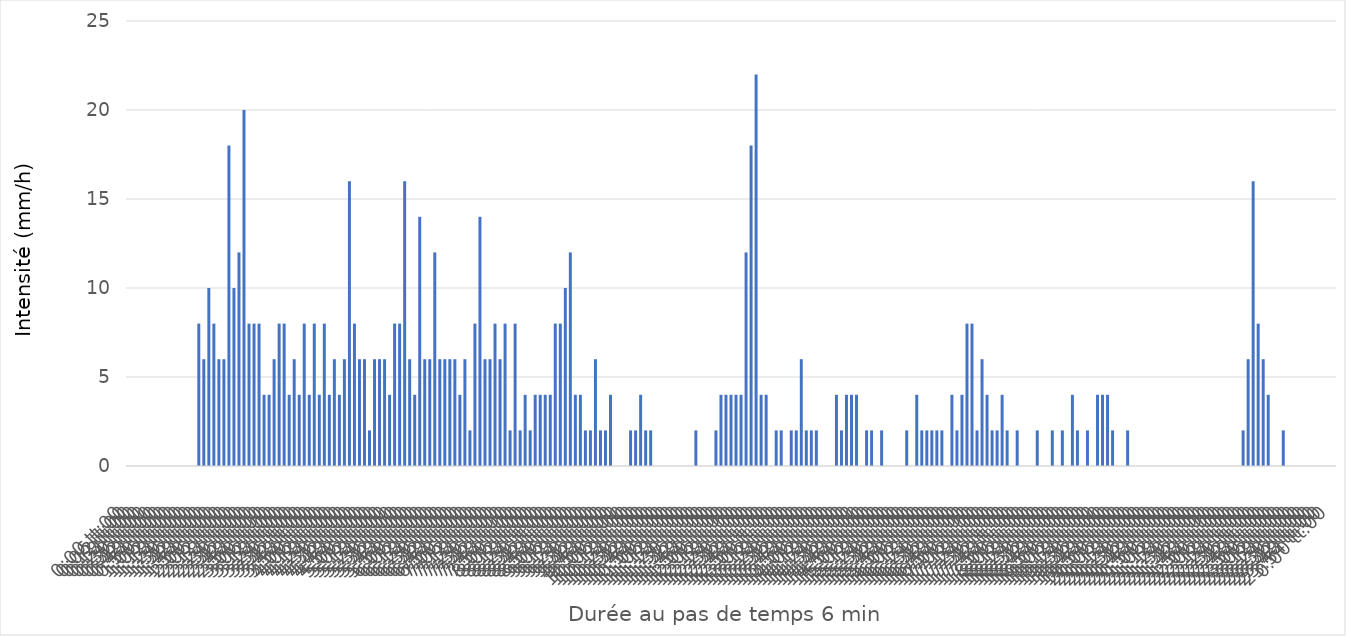
| Category | Series 0 |
|---|---|
| 0.0 | 0 |
| 0.004166666666666667 | 0 |
| 0.00833333333333333 | 0 |
| 0.0125 | 0 |
| 0.0166666666666667 | 0 |
| 0.0208333333333333 | 0 |
| 0.025 | 0 |
| 0.0291666666666667 | 0 |
| 0.0333333333333333 | 0 |
| 0.0375 | 0 |
| 0.0416666666666667 | 0 |
| 0.0458333333333333 | 0 |
| 0.05 | 0 |
| 0.0541666666666667 | 0 |
| 0.0583333333333333 | 8 |
| 0.0625 | 6 |
| 0.0666666666666667 | 10 |
| 0.0708333333333333 | 8 |
| 0.075 | 6 |
| 0.0791666666666667 | 6 |
| 0.0833333333333333 | 18 |
| 0.0875 | 10 |
| 0.0916666666666667 | 12 |
| 0.0958333333333333 | 20 |
| 0.1 | 8 |
| 0.104166666666667 | 8 |
| 0.108333333333333 | 8 |
| 0.1125 | 4 |
| 0.116666666666667 | 4 |
| 0.120833333333333 | 6 |
| 0.125 | 8 |
| 0.129166666666667 | 8 |
| 0.133333333333333 | 4 |
| 0.1375 | 6 |
| 0.141666666666667 | 4 |
| 0.145833333333333 | 8 |
| 0.15 | 4 |
| 0.154166666666667 | 8 |
| 0.158333333333333 | 4 |
| 0.1625 | 8 |
| 0.166666666666667 | 4 |
| 0.170833333333333 | 6 |
| 0.175 | 4 |
| 0.179166666666667 | 6 |
| 0.183333333333333 | 16 |
| 0.1875 | 8 |
| 0.191666666666667 | 6 |
| 0.195833333333333 | 6 |
| 0.2 | 2 |
| 0.204166666666667 | 6 |
| 0.208333333333333 | 6 |
| 0.2125 | 6 |
| 0.216666666666667 | 4 |
| 0.220833333333333 | 8 |
| 0.225 | 8 |
| 0.229166666666667 | 16 |
| 0.233333333333333 | 6 |
| 0.2375 | 4 |
| 0.241666666666667 | 14 |
| 0.245833333333333 | 6 |
| 0.25 | 6 |
| 0.254166666666667 | 12 |
| 0.258333333333333 | 6 |
| 0.2625 | 6 |
| 0.266666666666667 | 6 |
| 0.270833333333333 | 6 |
| 0.275 | 4 |
| 0.279166666666667 | 6 |
| 0.283333333333333 | 2 |
| 0.2875 | 8 |
| 0.291666666666667 | 14 |
| 0.295833333333333 | 6 |
| 0.3 | 6 |
| 0.304166666666667 | 8 |
| 0.308333333333333 | 6 |
| 0.3125 | 8 |
| 0.316666666666667 | 2 |
| 0.320833333333333 | 8 |
| 0.325 | 2 |
| 0.329166666666667 | 4 |
| 0.333333333333333 | 2 |
| 0.3375 | 4 |
| 0.341666666666667 | 4 |
| 0.345833333333333 | 4 |
| 0.35 | 4 |
| 0.354166666666667 | 8 |
| 0.358333333333333 | 8 |
| 0.3625 | 10 |
| 0.366666666666667 | 12 |
| 0.370833333333333 | 4 |
| 0.375 | 4 |
| 0.379166666666667 | 2 |
| 0.383333333333333 | 2 |
| 0.3875 | 6 |
| 0.391666666666667 | 2 |
| 0.395833333333333 | 2 |
| 0.4 | 4 |
| 0.404166666666667 | 0 |
| 0.408333333333333 | 0 |
| 0.4125 | 0 |
| 0.416666666666667 | 2 |
| 0.420833333333333 | 2 |
| 0.425 | 4 |
| 0.429166666666667 | 2 |
| 0.433333333333333 | 2 |
| 0.4375 | 0 |
| 0.441666666666667 | 0 |
| 0.445833333333333 | 0 |
| 0.45 | 0 |
| 0.454166666666667 | 0 |
| 0.458333333333333 | 0 |
| 0.4625 | 0 |
| 0.466666666666667 | 0 |
| 0.470833333333333 | 2 |
| 0.475 | 0 |
| 0.479166666666667 | 0 |
| 0.483333333333333 | 0 |
| 0.4875 | 2 |
| 0.491666666666667 | 4 |
| 0.495833333333333 | 4 |
| 0.5 | 4 |
| 0.504166666666667 | 4 |
| 0.508333333333333 | 4 |
| 0.5125 | 12 |
| 0.516666666666667 | 18 |
| 0.520833333333333 | 22 |
| 0.525 | 4 |
| 0.529166666666667 | 4 |
| 0.533333333333333 | 0 |
| 0.5375 | 2 |
| 0.541666666666667 | 2 |
| 0.545833333333333 | 0 |
| 0.55 | 2 |
| 0.554166666666667 | 2 |
| 0.558333333333333 | 6 |
| 0.5625 | 2 |
| 0.566666666666667 | 2 |
| 0.570833333333333 | 2 |
| 0.575 | 0 |
| 0.579166666666667 | 0 |
| 0.583333333333333 | 0 |
| 0.5875 | 4 |
| 0.591666666666667 | 2 |
| 0.595833333333333 | 4 |
| 0.6 | 4 |
| 0.604166666666667 | 4 |
| 0.608333333333333 | 0 |
| 0.6125 | 2 |
| 0.616666666666667 | 2 |
| 0.620833333333333 | 0 |
| 0.625 | 2 |
| 0.629166666666667 | 0 |
| 0.633333333333333 | 0 |
| 0.6375 | 0 |
| 0.641666666666667 | 0 |
| 0.645833333333333 | 2 |
| 0.65 | 0 |
| 0.654166666666667 | 4 |
| 0.658333333333333 | 2 |
| 0.6625 | 2 |
| 0.666666666666667 | 2 |
| 0.670833333333333 | 2 |
| 0.675 | 2 |
| 0.679166666666667 | 0 |
| 0.683333333333333 | 4 |
| 0.6875 | 2 |
| 0.691666666666667 | 4 |
| 0.695833333333333 | 8 |
| 0.7 | 8 |
| 0.704166666666667 | 2 |
| 0.708333333333333 | 6 |
| 0.7125 | 4 |
| 0.716666666666667 | 2 |
| 0.720833333333333 | 2 |
| 0.725 | 4 |
| 0.729166666666667 | 2 |
| 0.733333333333333 | 0 |
| 0.7375 | 2 |
| 0.741666666666667 | 0 |
| 0.745833333333333 | 0 |
| 0.75 | 0 |
| 0.754166666666667 | 2 |
| 0.758333333333333 | 0 |
| 0.7625 | 0 |
| 0.766666666666667 | 2 |
| 0.770833333333333 | 0 |
| 0.775 | 2 |
| 0.779166666666667 | 0 |
| 0.783333333333333 | 4 |
| 0.7875 | 2 |
| 0.791666666666667 | 0 |
| 0.795833333333333 | 2 |
| 0.8 | 0 |
| 0.804166666666667 | 4 |
| 0.808333333333333 | 4 |
| 0.8125 | 4 |
| 0.816666666666667 | 2 |
| 0.820833333333333 | 0 |
| 0.825 | 0 |
| 0.829166666666667 | 2 |
| 0.833333333333333 | 0 |
| 0.8375 | 0 |
| 0.841666666666667 | 0 |
| 0.845833333333333 | 0 |
| 0.85 | 0 |
| 0.854166666666667 | 0 |
| 0.858333333333333 | 0 |
| 0.8625 | 0 |
| 0.866666666666667 | 0 |
| 0.870833333333333 | 0 |
| 0.875 | 0 |
| 0.879166666666667 | 0 |
| 0.883333333333333 | 0 |
| 0.8875 | 0 |
| 0.891666666666667 | 0 |
| 0.895833333333333 | 0 |
| 0.9 | 0 |
| 0.904166666666667 | 0 |
| 0.908333333333333 | 0 |
| 0.9125 | 0 |
| 0.916666666666667 | 0 |
| 0.920833333333333 | 0 |
| 0.925 | 2 |
| 0.929166666666667 | 6 |
| 0.933333333333333 | 16 |
| 0.9375 | 8 |
| 0.941666666666667 | 6 |
| 0.945833333333333 | 4 |
| 0.95 | 0 |
| 0.954166666666667 | 0 |
| 0.958333333333333 | 2 |
| 0.9625 | 0 |
| 0.966666666666667 | 0 |
| 0.970833333333333 | 0 |
| 0.975 | 0 |
| 0.979166666666667 | 0 |
| 0.983333333333333 | 0 |
| 0.9875 | 0 |
| 0.991666666666667 | 0 |
| 0.995833333333333 | 0 |
| 1900-01-01 | 0 |